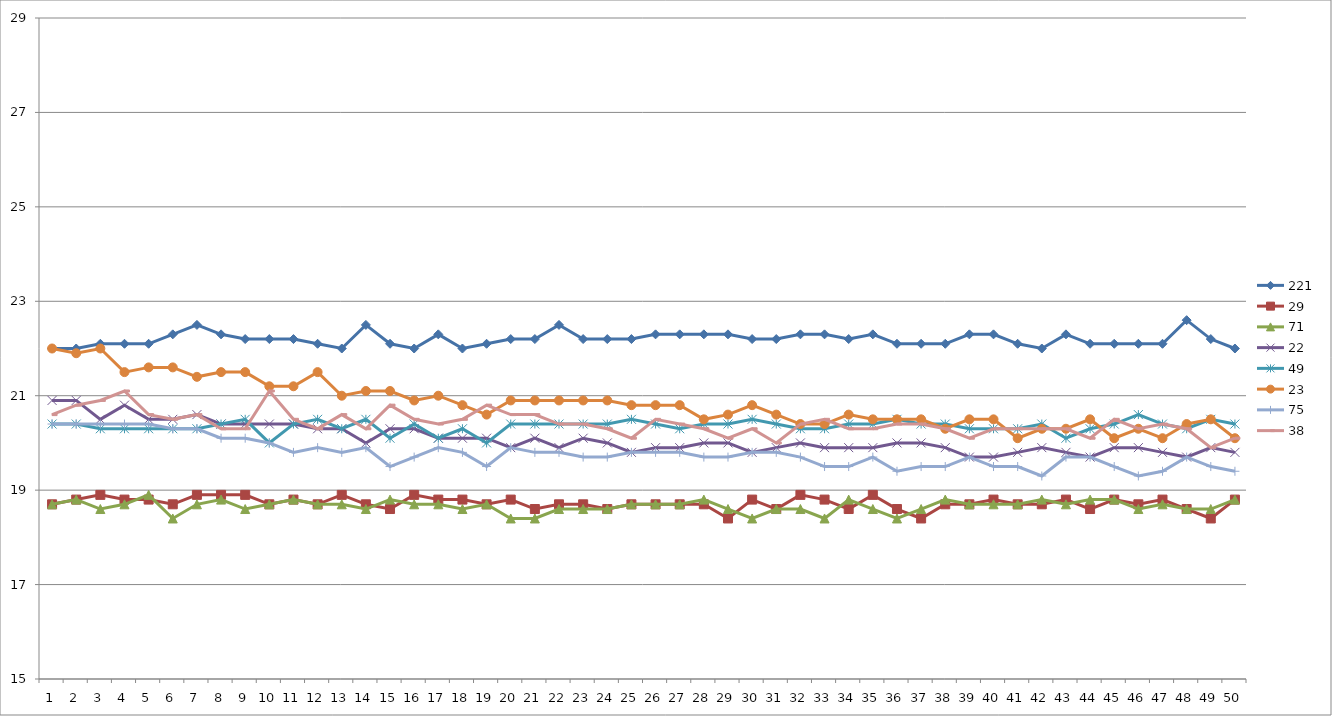
| Category | 221 | 29 | 71 | 22 | 49 | 23 | 75 | 38 |
|---|---|---|---|---|---|---|---|---|
| 0 | 22 | 18.7 | 18.7 | 20.9 | 20.4 | 22 | 20.4 | 20.6 |
| 1 | 22 | 18.8 | 18.8 | 20.9 | 20.4 | 21.9 | 20.4 | 20.8 |
| 2 | 22.1 | 18.9 | 18.6 | 20.5 | 20.3 | 22 | 20.4 | 20.9 |
| 3 | 22.1 | 18.8 | 18.7 | 20.8 | 20.3 | 21.5 | 20.4 | 21.1 |
| 4 | 22.1 | 18.8 | 18.9 | 20.5 | 20.3 | 21.6 | 20.4 | 20.6 |
| 5 | 22.3 | 18.7 | 18.4 | 20.5 | 20.3 | 21.6 | 20.3 | 20.5 |
| 6 | 22.5 | 18.9 | 18.7 | 20.6 | 20.3 | 21.4 | 20.3 | 20.6 |
| 7 | 22.3 | 18.9 | 18.8 | 20.4 | 20.4 | 21.5 | 20.1 | 20.3 |
| 8 | 22.2 | 18.9 | 18.6 | 20.4 | 20.5 | 21.5 | 20.1 | 20.3 |
| 9 | 22.2 | 18.7 | 18.7 | 20.4 | 20 | 21.2 | 20 | 21.1 |
| 10 | 22.2 | 18.8 | 18.8 | 20.4 | 20.4 | 21.2 | 19.8 | 20.5 |
| 11 | 22.1 | 18.7 | 18.7 | 20.3 | 20.5 | 21.5 | 19.9 | 20.3 |
| 12 | 22 | 18.9 | 18.7 | 20.3 | 20.3 | 21 | 19.8 | 20.6 |
| 13 | 22.5 | 18.7 | 18.6 | 20 | 20.5 | 21.1 | 19.9 | 20.3 |
| 14 | 22.1 | 18.6 | 18.8 | 20.3 | 20.1 | 21.1 | 19.5 | 20.8 |
| 15 | 22 | 18.9 | 18.7 | 20.3 | 20.4 | 20.9 | 19.7 | 20.5 |
| 16 | 22.3 | 18.8 | 18.7 | 20.1 | 20.1 | 21 | 19.9 | 20.4 |
| 17 | 22 | 18.8 | 18.6 | 20.1 | 20.3 | 20.8 | 19.8 | 20.5 |
| 18 | 22.1 | 18.7 | 18.7 | 20.1 | 20 | 20.6 | 19.5 | 20.8 |
| 19 | 22.2 | 18.8 | 18.4 | 19.9 | 20.4 | 20.9 | 19.9 | 20.6 |
| 20 | 22.2 | 18.6 | 18.4 | 20.1 | 20.4 | 20.9 | 19.8 | 20.6 |
| 21 | 22.5 | 18.7 | 18.6 | 19.9 | 20.4 | 20.9 | 19.8 | 20.4 |
| 22 | 22.2 | 18.7 | 18.6 | 20.1 | 20.4 | 20.9 | 19.7 | 20.4 |
| 23 | 22.2 | 18.6 | 18.6 | 20 | 20.4 | 20.9 | 19.7 | 20.3 |
| 24 | 22.2 | 18.7 | 18.7 | 19.8 | 20.5 | 20.8 | 19.8 | 20.1 |
| 25 | 22.3 | 18.7 | 18.7 | 19.9 | 20.4 | 20.8 | 19.8 | 20.5 |
| 26 | 22.3 | 18.7 | 18.7 | 19.9 | 20.3 | 20.8 | 19.8 | 20.4 |
| 27 | 22.3 | 18.7 | 18.8 | 20 | 20.4 | 20.5 | 19.7 | 20.3 |
| 28 | 22.3 | 18.4 | 18.6 | 20 | 20.4 | 20.6 | 19.7 | 20.1 |
| 29 | 22.2 | 18.8 | 18.4 | 19.8 | 20.5 | 20.8 | 19.8 | 20.3 |
| 30 | 22.2 | 18.6 | 18.6 | 19.9 | 20.4 | 20.6 | 19.8 | 20 |
| 31 | 22.3 | 18.9 | 18.6 | 20 | 20.3 | 20.4 | 19.7 | 20.4 |
| 32 | 22.3 | 18.8 | 18.4 | 19.9 | 20.3 | 20.4 | 19.5 | 20.5 |
| 33 | 22.2 | 18.6 | 18.8 | 19.9 | 20.4 | 20.6 | 19.5 | 20.3 |
| 34 | 22.3 | 18.9 | 18.6 | 19.9 | 20.4 | 20.5 | 19.7 | 20.3 |
| 35 | 22.1 | 18.6 | 18.4 | 20 | 20.5 | 20.5 | 19.4 | 20.4 |
| 36 | 22.1 | 18.4 | 18.6 | 20 | 20.4 | 20.5 | 19.5 | 20.4 |
| 37 | 22.1 | 18.7 | 18.8 | 19.9 | 20.4 | 20.3 | 19.5 | 20.3 |
| 38 | 22.3 | 18.7 | 18.7 | 19.7 | 20.3 | 20.5 | 19.7 | 20.1 |
| 39 | 22.3 | 18.8 | 18.7 | 19.7 | 20.3 | 20.5 | 19.5 | 20.3 |
| 40 | 22.1 | 18.7 | 18.7 | 19.8 | 20.3 | 20.1 | 19.5 | 20.3 |
| 41 | 22 | 18.7 | 18.8 | 19.9 | 20.4 | 20.3 | 19.3 | 20.3 |
| 42 | 22.3 | 18.8 | 18.7 | 19.8 | 20.1 | 20.3 | 19.7 | 20.3 |
| 43 | 22.1 | 18.6 | 18.8 | 19.7 | 20.3 | 20.5 | 19.7 | 20.1 |
| 44 | 22.1 | 18.8 | 18.8 | 19.9 | 20.4 | 20.1 | 19.5 | 20.5 |
| 45 | 22.1 | 18.7 | 18.6 | 19.9 | 20.6 | 20.3 | 19.3 | 20.3 |
| 46 | 22.1 | 18.8 | 18.7 | 19.8 | 20.4 | 20.1 | 19.4 | 20.4 |
| 47 | 22.6 | 18.6 | 18.6 | 19.7 | 20.3 | 20.4 | 19.7 | 20.3 |
| 48 | 22.2 | 18.4 | 18.6 | 19.9 | 20.5 | 20.5 | 19.5 | 19.9 |
| 49 | 22 | 18.8 | 18.8 | 19.8 | 20.4 | 20.1 | 19.4 | 20.1 |